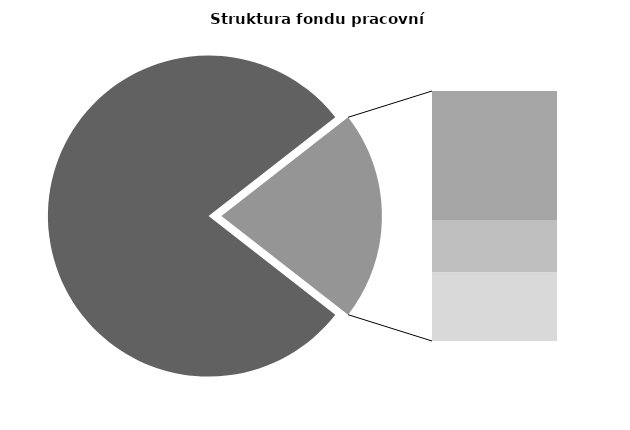
| Category | Series 0 |
|---|---|
| Průměrná měsíční odpracovaná doba bez přesčasu | 135.854 |
| Dovolená | 18.822 |
| Nemoc | 7.519 |
| Jiné | 9.923 |